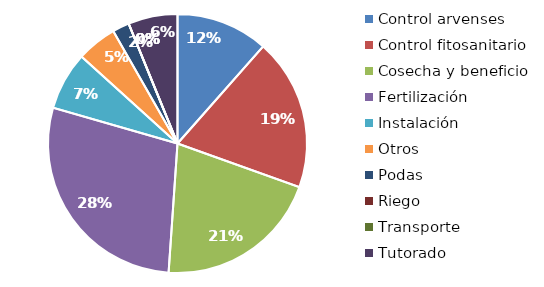
| Category | Valor |
|---|---|
| Control arvenses | 3053000 |
| Control fitosanitario | 5031000 |
| Cosecha y beneficio | 5472000 |
| Fertilización | 7525000 |
| Instalación | 1923000 |
| Otros | 1333000 |
| Podas | 559000 |
| Riego | 0 |
| Transporte | 0 |
| Tutorado | 1634000 |